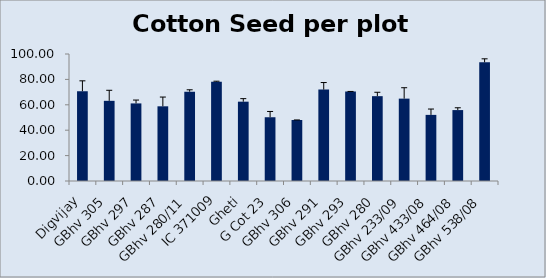
| Category | Cotton Seed per plot (g) |
|---|---|
| Digvijay | 70.69 |
| GBhv 305 | 63.13 |
| GBhv 297 | 61.095 |
| GBhv 287 | 58.81 |
| GBhv 280/11 | 70.32 |
| IC 371009 | 78.215 |
| Gheti | 62.46 |
| G Cot 23 | 50.205 |
| GBhv 306 | 48.045 |
| GBhv 291 | 71.965 |
| GBhv 293 | 70.45 |
| GBhv 280 | 66.8 |
| GBhv 233/09 | 64.855 |
| GBhv 433/08 | 52.06 |
| GBhv 464/08 | 55.84 |
| GBhv 538/08 | 93.47 |